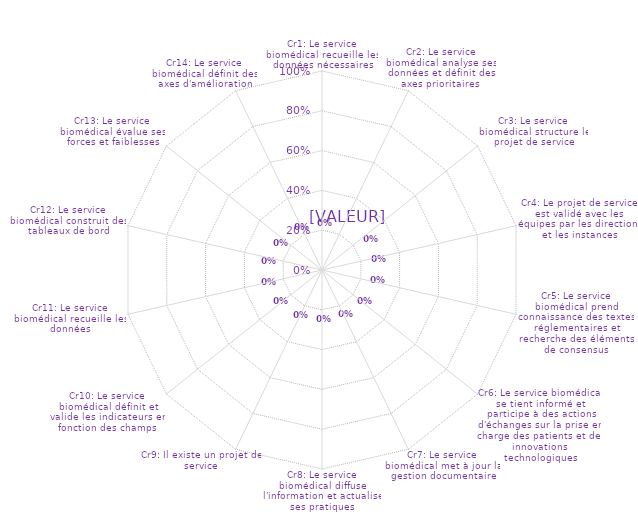
| Category | Graphes RADAR pour Résultats Globaux BPM  |
|---|---|
| Cr1: Le service biomédical recueille les données nécessaires | 0 |
| Cr2: Le service biomédical analyse ses données et définit des axes prioritaires  | 0 |
| Cr3: Le service biomédical structure le projet de service | 0 |
| Cr4: Le projet de service est validé avec les équipes par les directions et les instances | 0 |
| Cr5: Le service biomédical prend connaissance des textes réglementaires et recherche des éléments de consensus | 0 |
| Cr6: Le service biomédical se tient informé et participe à des actions d'échanges sur la prise en charge des patients et des innovations technologiques | 0 |
| Cr7: Le service biomédical met à jour la gestion documentaire | 0 |
| Cr8: Le service biomédical diffuse l'information et actualise ses pratiques | 0 |
| Cr9: Il existe un projet de service | 0 |
| Cr10: Le service biomédical définit et valide les indicateurs en fonction des champs | 0 |
| Cr11: Le service biomédical recueille les données | 0 |
| Cr12: Le service biomédical construit des tableaux de bord | 0 |
| Cr13: Le service biomédical évalue ses forces et faiblesses | 0 |
| Cr14: Le service biomédical définit des axes d'amélioration | 0 |